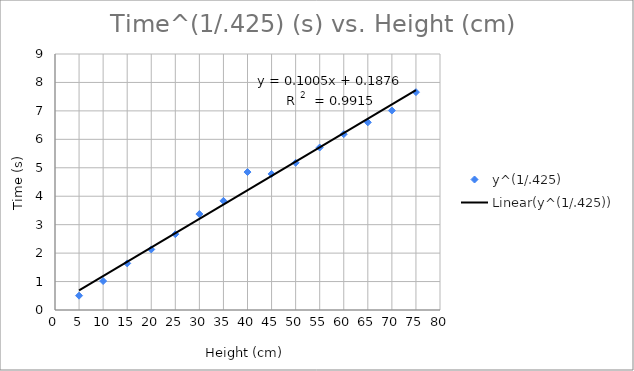
| Category | y^(1/.425) |
|---|---|
| 5.0 | 0.503 |
| 10.0 | 1.018 |
| 15.0 | 1.638 |
| 20.0 | 2.129 |
| 25.0 | 2.665 |
| 30.0 | 3.374 |
| 35.0 | 3.837 |
| 40.0 | 4.85 |
| 45.0 | 4.784 |
| 50.0 | 5.175 |
| 55.0 | 5.712 |
| 60.0 | 6.181 |
| 65.0 | 6.597 |
| 70.0 | 7.013 |
| 75.0 | 7.659 |